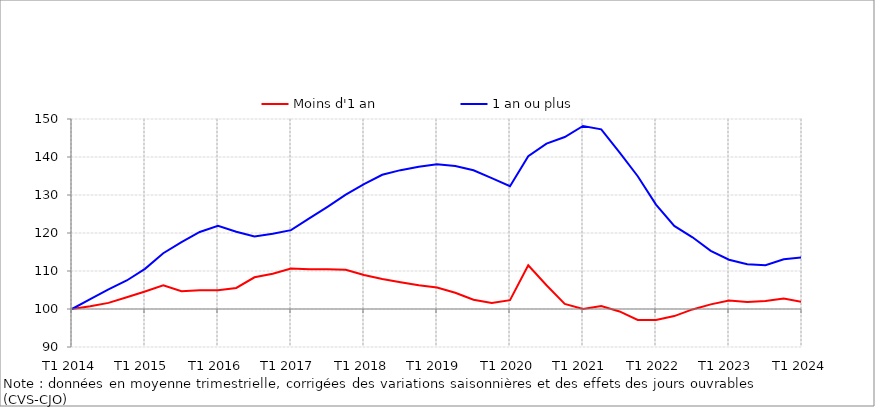
| Category | Moins d'1 an | 1 an ou plus |
|---|---|---|
| T1 2014 | 100 | 100 |
| T2 2014 | 100.745 | 102.599 |
| T3 2014 | 101.614 | 105.145 |
| T4 2014 | 103.111 | 107.504 |
| T1 2015 | 104.624 | 110.559 |
| T2 2015 | 106.246 | 114.679 |
| T3 2015 | 104.698 | 117.578 |
| T4 2015 | 104.91 | 120.273 |
| T1 2016 | 104.929 | 121.926 |
| T2 2016 | 105.533 | 120.345 |
| T3 2016 | 108.339 | 119.105 |
| T4 2016 | 109.259 | 119.782 |
| T1 2017 | 110.639 | 120.758 |
| T2 2017 | 110.431 | 123.837 |
| T3 2017 | 110.447 | 126.897 |
| T4 2017 | 110.317 | 130.107 |
| T1 2018 | 108.95 | 132.874 |
| T2 2018 | 107.9 | 135.33 |
| T3 2018 | 107.03 | 136.539 |
| T4 2018 | 106.226 | 137.432 |
| T1 2019 | 105.631 | 138.121 |
| T2 2019 | 104.263 | 137.647 |
| T3 2019 | 102.422 | 136.516 |
| T4 2019 | 101.556 | 134.461 |
| T1 2020 | 102.332 | 132.305 |
| T2 2020 | 111.513 | 140.235 |
| T3 2020 | 106.258 | 143.517 |
| T4 2020 | 101.348 | 145.254 |
| T1 2021 | 100.012 | 148.176 |
| T2 2021 | 100.807 | 147.266 |
| T3 2021 | 99.361 | 141.229 |
| T4 2021 | 97.1 | 134.934 |
| T1 2022 | 97.092 | 127.472 |
| T2 2022 | 98.135 | 121.872 |
| T3 2022 | 99.89 | 118.872 |
| T4 2022 | 101.215 | 115.32 |
| T1 2023 | 102.241 | 112.978 |
| T2 2023 | 101.861 | 111.799 |
| T3 2023 | 102.081 | 111.499 |
| T4 2023 | 102.747 | 113.11 |
| T1 2024 | 101.877 | 113.607 |